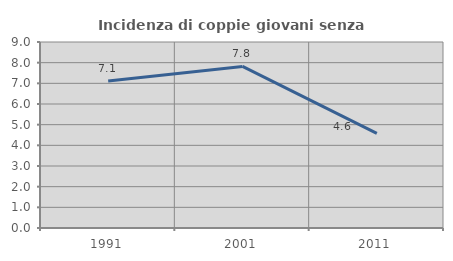
| Category | Incidenza di coppie giovani senza figli |
|---|---|
| 1991.0 | 7.111 |
| 2001.0 | 7.819 |
| 2011.0 | 4.575 |